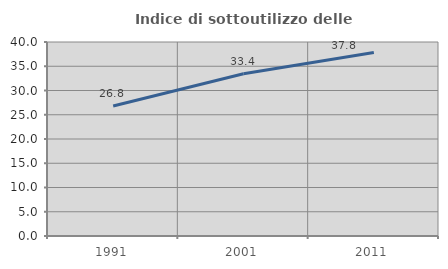
| Category | Indice di sottoutilizzo delle abitazioni  |
|---|---|
| 1991.0 | 26.811 |
| 2001.0 | 33.444 |
| 2011.0 | 37.83 |